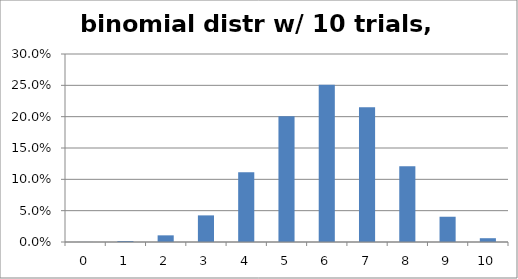
| Category | 0.6 |
|---|---|
| 0.0 | 0 |
| 1.0 | 0.002 |
| 2.0 | 0.011 |
| 3.0 | 0.042 |
| 4.0 | 0.111 |
| 5.0 | 0.201 |
| 6.0 | 0.251 |
| 7.0 | 0.215 |
| 8.0 | 0.121 |
| 9.0 | 0.04 |
| 10.0 | 0.006 |